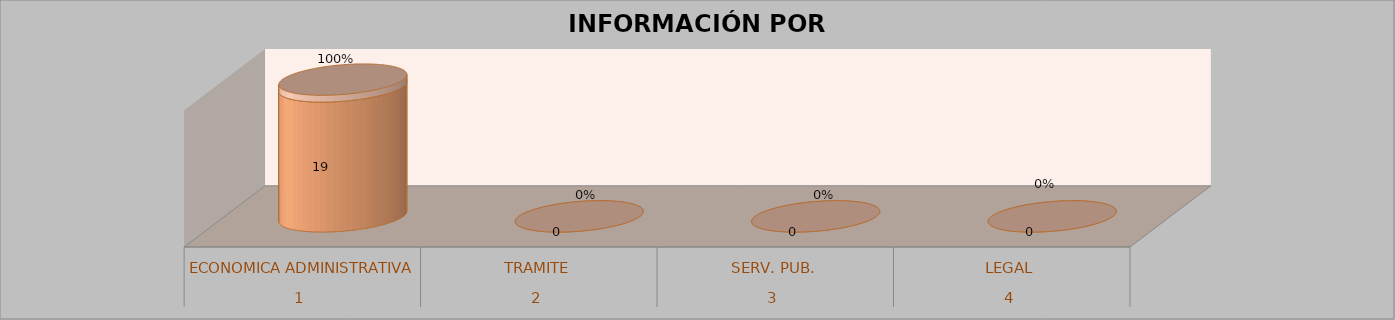
| Category | Series 0 | Series 1 | Series 2 | Series 3 |
|---|---|---|---|---|
| 0 |  |  | 19 | 1 |
| 1 |  |  | 0 | 0 |
| 2 |  |  | 0 | 0 |
| 3 |  |  | 0 | 0 |